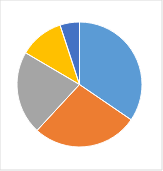
| Category | Series 0 |
|---|---|
| 0 | 0.348 |
| 1 | 0.275 |
| 2 | 0.217 |
| 3 | 0.116 |
| 4 | 0.051 |